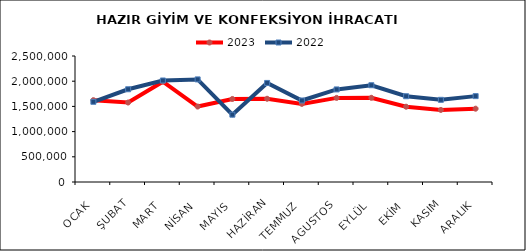
| Category | 2023 | 2022 |
|---|---|---|
| OCAK | 1623739.362 | 1591558.012 |
| ŞUBAT | 1576681.904 | 1840227.134 |
| MART | 1989839.692 | 2014016.527 |
| NİSAN | 1496695.548 | 2035670.006 |
| MAYIS | 1647576.854 | 1335833.58 |
| HAZİRAN | 1651357.975 | 1965643.86 |
| TEMMUZ | 1550041.942 | 1617482.31 |
| AGUSTOS | 1668845.711 | 1836844.14 |
| EYLÜL | 1670449.561 | 1919975.111 |
| EKİM | 1493652.732 | 1701714.944 |
| KASIM | 1430114.189 | 1630644.623 |
| ARALIK | 1454726.794 | 1703955.415 |